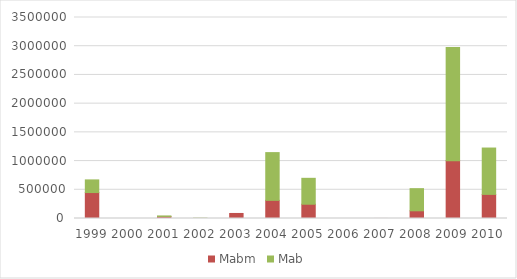
| Category | Mabm | Mab |
|---|---|---|
| 1999.0 | 451888 | 220313 |
| 2000.0 | 0 | 0 |
| 2001.0 | 35811 | 8325 |
| 2002.0 | 946 | 4715 |
| 2003.0 | 87701 | 0 |
| 2004.0 | 315888 | 831558 |
| 2005.0 | 248490 | 451215 |
| 2006.0 | 462 | 0 |
| 2007.0 | 639 | 0 |
| 2008.0 | 134043 | 385689 |
| 2009.0 | 1007520 | 1969630 |
| 2010.0 | 419769 | 807249 |